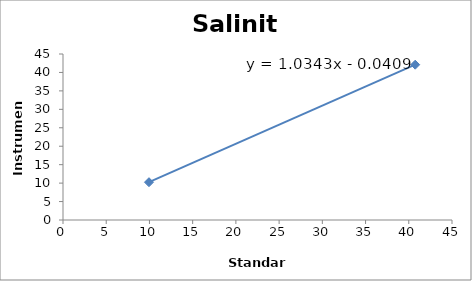
| Category | Salinity |
|---|---|
| 40.745 | 42.101 |
| 9.945 | 10.245 |